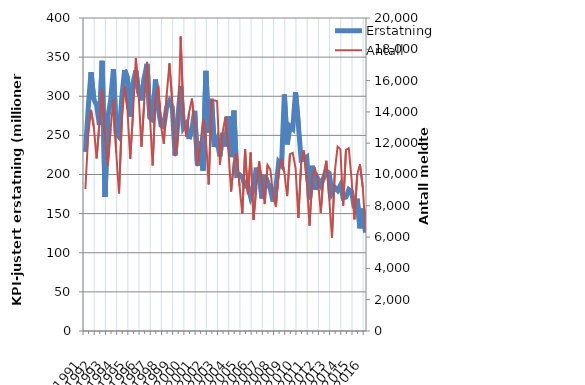
| Category | Erstatning |
|---|---|
| 1991.0 | 228.749 |
| nan | 284.604 |
| nan | 330.774 |
| nan | 296.254 |
| 1992.0 | 288.387 |
| nan | 263.506 |
| nan | 345.323 |
| nan | 171.267 |
| 1993.0 | 273.217 |
| nan | 294.381 |
| nan | 334.687 |
| nan | 252.715 |
| 1994.0 | 248.414 |
| nan | 299.114 |
| nan | 333.638 |
| nan | 323.684 |
| 1995.0 | 274.062 |
| nan | 317.038 |
| nan | 332.935 |
| nan | 304.87 |
| 1996.0 | 294.738 |
| nan | 323.554 |
| nan | 341.375 |
| nan | 272.922 |
| 1997.0 | 269.83 |
| nan | 321.383 |
| nan | 284.465 |
| nan | 262.977 |
| 1998.0 | 261.016 |
| nan | 286.331 |
| nan | 293.608 |
| nan | 285.708 |
| 1999.0 | 224.452 |
| nan | 272.35 |
| nan | 313.004 |
| nan | 259.609 |
| 2000.0 | 264.631 |
| nan | 245.415 |
| nan | 257.428 |
| nan | 281.433 |
| 2001.0 | 211.635 |
| nan | 242.737 |
| nan | 204.98 |
| nan | 332.459 |
| 2002.0 | 253.124 |
| nan | 296.757 |
| nan | 235.339 |
| nan | 244.335 |
| 2003.0 | 223.241 |
| nan | 252.96 |
| nan | 235.873 |
| nan | 274.261 |
| 2004.0 | 222.116 |
| nan | 281.572 |
| nan | 198.937 |
| nan | 199.767 |
| 2005.0 | 196.359 |
| nan | 185.065 |
| nan | 185.833 |
| nan | 171.134 |
| 2006.0 | 180.565 |
| nan | 208.811 |
| nan | 199.152 |
| nan | 169.287 |
| 2007.0 | 199.17 |
| nan | 190.26 |
| nan | 181.455 |
| nan | 165.26 |
| 2008.0 | 183.609 |
| nan | 215.888 |
| nan | 211.574 |
| nan | 302.246 |
| 2009.0 | 238.443 |
| nan | 261.694 |
| nan | 258.418 |
| nan | 305.219 |
| 2010.0 | 264.067 |
| nan | 218.648 |
| nan | 219.545 |
| nan | 222.163 |
| 2011.0 | 168.039 |
| nan | 211.087 |
| nan | 180.746 |
| nan | 194.01 |
| 2012.0 | 186.546 |
| nan | 195.537 |
| nan | 204.354 |
| nan | 201.669 |
| 2013.0 | 176.429 |
| nan | 183.382 |
| nan | 179.613 |
| nan | 186.09 |
| 2014.0 | 170.028 |
| nan | 171.115 |
| nan | 180.65 |
| nan | 177.838 |
| 2015.0 | 156.941 |
| nan | 169.095 |
| nan | 131.257 |
| nan | 156.432 |
| 2016.0 | 125.98 |